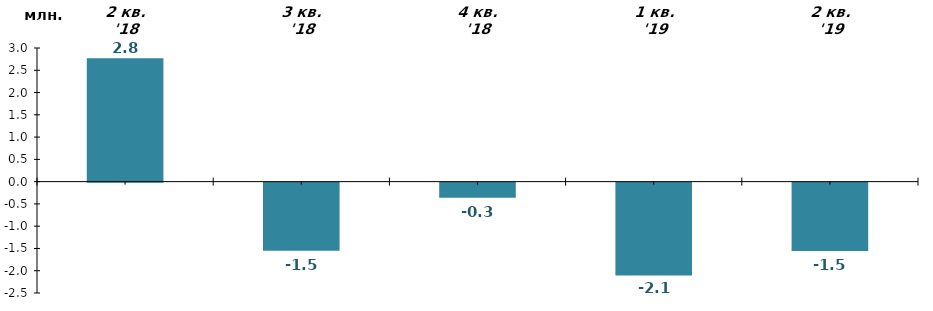
| Category | млн. грн. |
|---|---|
| 2 кв. '18 | 2.77 |
| 3 кв. '18 | -1.532 |
| 4 кв. '18 | -0.341 |
| 1 кв. '19 | -2.084 |
| 2 кв. '19 | -1.537 |